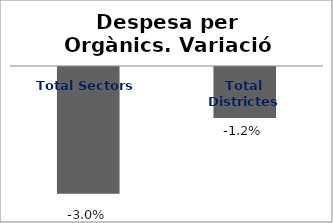
| Category | Series 0 |
|---|---|
| Total Sectors | -0.03 |
| Total Districtes | -0.012 |